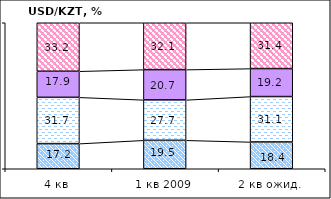
| Category | повысится | не изменится | снизится | не знаю |
|---|---|---|---|---|
| 4 кв | 17.21 | 31.71 | 17.87 | 33.21 |
| 1 кв 2009 | 19.49 | 27.67 | 20.74 | 32.1 |
| 2 кв ожид. | 18.35 | 31.1 | 19.16 | 31.39 |